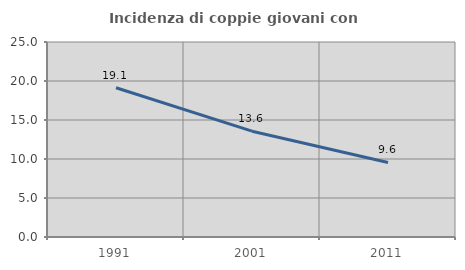
| Category | Incidenza di coppie giovani con figli |
|---|---|
| 1991.0 | 19.134 |
| 2001.0 | 13.566 |
| 2011.0 | 9.555 |